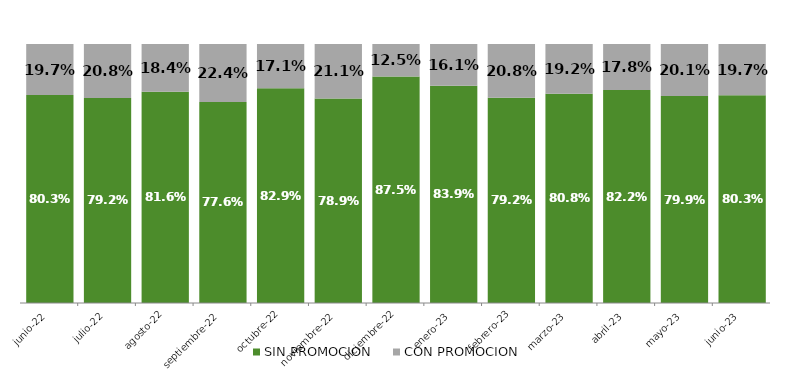
| Category | SIN PROMOCION   | CON PROMOCION   |
|---|---|---|
| 2022-06-01 | 0.803 | 0.197 |
| 2022-07-01 | 0.792 | 0.208 |
| 2022-08-01 | 0.816 | 0.184 |
| 2022-09-01 | 0.776 | 0.224 |
| 2022-10-01 | 0.829 | 0.171 |
| 2022-11-01 | 0.789 | 0.211 |
| 2022-12-01 | 0.875 | 0.125 |
| 2023-01-01 | 0.839 | 0.161 |
| 2023-02-01 | 0.792 | 0.208 |
| 2023-03-01 | 0.808 | 0.192 |
| 2023-04-01 | 0.822 | 0.178 |
| 2023-05-01 | 0.799 | 0.201 |
| 2023-06-01 | 0.803 | 0.197 |